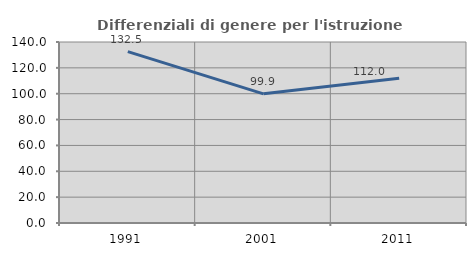
| Category | Differenziali di genere per l'istruzione superiore |
|---|---|
| 1991.0 | 132.521 |
| 2001.0 | 99.896 |
| 2011.0 | 111.979 |